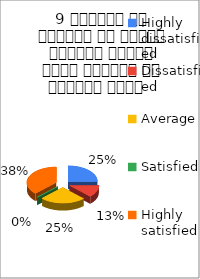
| Category | 9 शिक्षक ने शिक्षण के दौरान आधुनिक तकनीक पावर पॉइन्ट का प्रयोग किया   |
|---|---|
| Highly dissatisfied | 2 |
| Dissatisfied | 1 |
| Average | 2 |
| Satisfied | 0 |
| Highly satisfied | 3 |